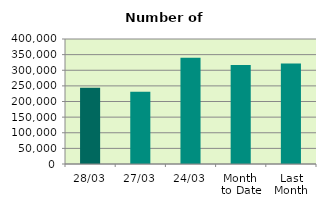
| Category | Series 0 |
|---|---|
| 28/03 | 243760 |
| 27/03 | 231226 |
| 24/03 | 340326 |
| Month 
to Date | 316904.9 |
| Last
Month | 321374.6 |